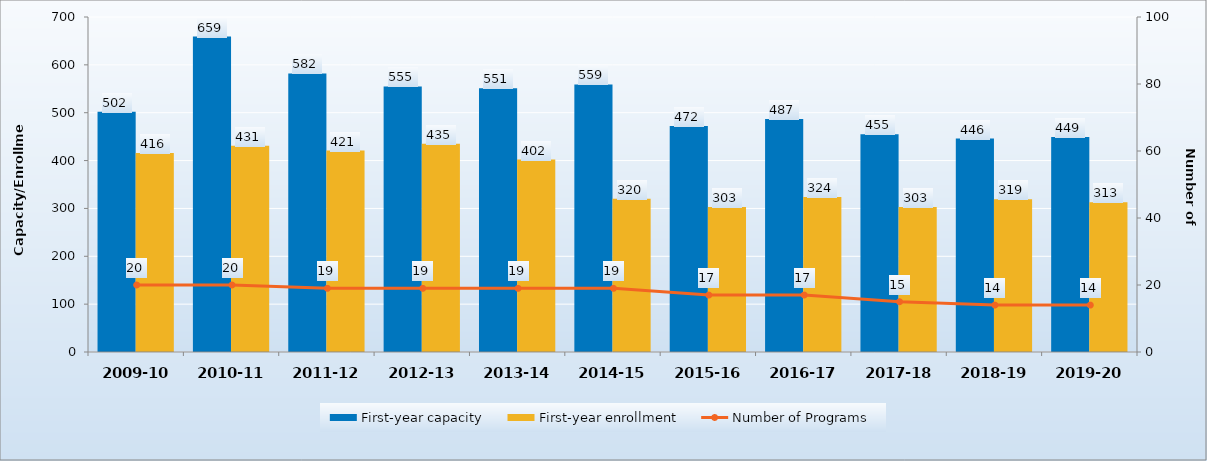
| Category | First-year capacity | First-year enrollment |
|---|---|---|
| 2009-10 | 502 | 416 |
| 2010-11 | 659 | 431 |
| 2011-12 | 582 | 421 |
| 2012-13 | 555 | 435 |
| 2013-14 | 551 | 402 |
| 2014-15 | 559 | 320 |
| 2015-16 | 472 | 303 |
| 2016-17 | 487 | 324 |
| 2017-18 | 455 | 303 |
| 2018-19 | 446 | 319 |
| 2019-20 | 449 | 313 |